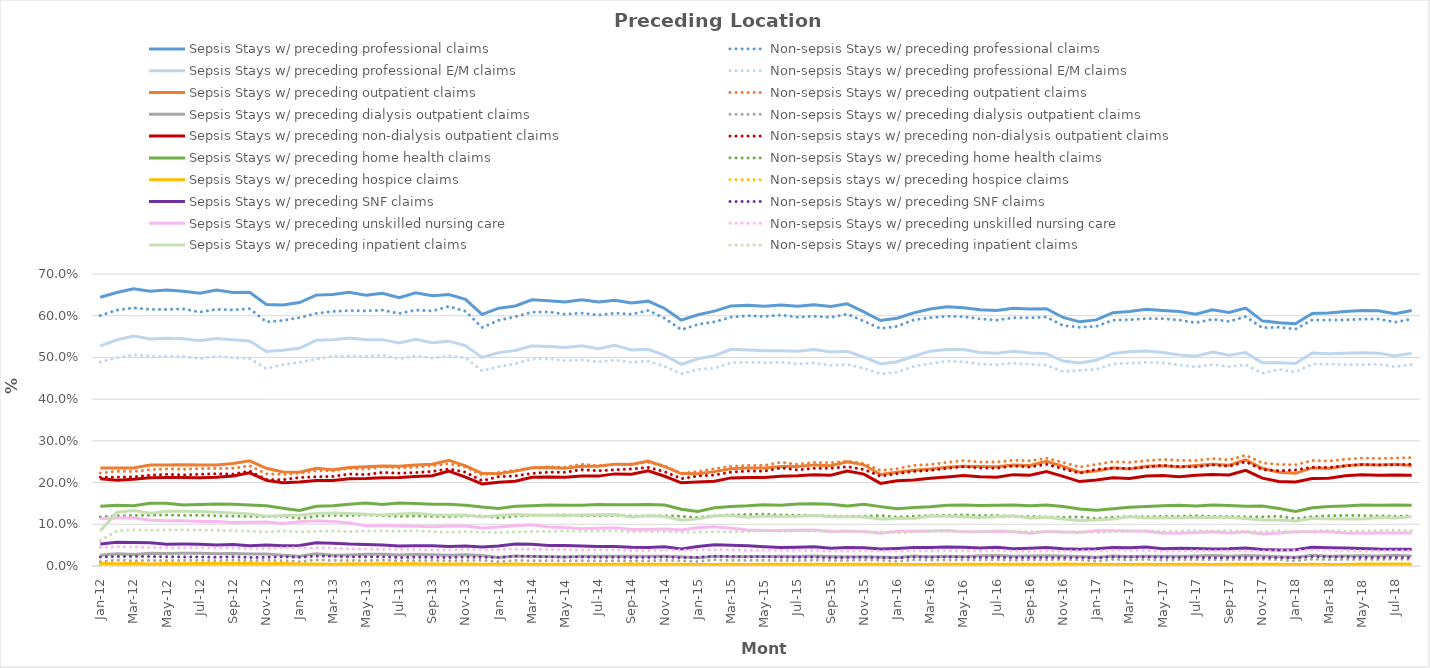
| Category | Sepsis Stays w/ preceding professional claims | Non-sepsis Stays w/ preceding professional claims | Sepsis Stays w/ preceding professional E/M claims | Non-sepsis Stays w/ preceding professional E/M claims | Sepsis Stays w/ preceding outpatient claims | Non-sepsis Stays w/ preceding outpatient claims | Sepsis Stays w/ preceding dialysis outpatient claims | Non-sepsis Stays w/ preceding dialysis outpatient claims | Sepsis Stays w/ preceding non-dialysis outpatient claims | Non-sepsis stays w/ preceding non-dialysis outpatient claims | Sepsis Stays w/ preceding home health claims | Non-sepsis Stays w/ preceding home health claims | Sepsis Stays w/ preceding hospice claims | Non-sepsis stays w/ preceding hospice claims | Sepsis Stays w/ preceding SNF claims | Non-sepsis Stays w/ preceding SNF claims | Sepsis Stays w/ preceding unskilled nursing care | Non-sepsis Stays w/ preceding unskilled nursing care | Sepsis Stays w/ preceding inpatient claims | Non-sepsis Stays w/ preceding inpatient claims |
|---|---|---|---|---|---|---|---|---|---|---|---|---|---|---|---|---|---|---|---|---|
| 2012-01-01 | 0.644 | 0.6 | 0.528 | 0.489 | 0.235 | 0.223 | 0.026 | 0.01 | 0.209 | 0.213 | 0.143 | 0.117 | 0.006 | 0.004 | 0.053 | 0.022 | 0.113 | 0.045 | 0.085 | 0.061 |
| 2012-02-01 | 0.656 | 0.614 | 0.542 | 0.499 | 0.235 | 0.227 | 0.029 | 0.014 | 0.205 | 0.213 | 0.145 | 0.12 | 0.005 | 0.004 | 0.057 | 0.023 | 0.115 | 0.046 | 0.129 | 0.084 |
| 2012-03-01 | 0.665 | 0.619 | 0.551 | 0.506 | 0.235 | 0.227 | 0.027 | 0.013 | 0.208 | 0.214 | 0.144 | 0.121 | 0.006 | 0.003 | 0.056 | 0.023 | 0.116 | 0.046 | 0.133 | 0.087 |
| 2012-04-01 | 0.659 | 0.615 | 0.544 | 0.503 | 0.242 | 0.231 | 0.03 | 0.013 | 0.212 | 0.218 | 0.15 | 0.122 | 0.005 | 0.004 | 0.056 | 0.023 | 0.11 | 0.044 | 0.126 | 0.086 |
| 2012-05-01 | 0.662 | 0.615 | 0.546 | 0.502 | 0.242 | 0.233 | 0.03 | 0.013 | 0.212 | 0.22 | 0.15 | 0.122 | 0.006 | 0.003 | 0.052 | 0.022 | 0.108 | 0.044 | 0.131 | 0.086 |
| 2012-06-01 | 0.659 | 0.616 | 0.545 | 0.503 | 0.243 | 0.232 | 0.031 | 0.013 | 0.212 | 0.218 | 0.146 | 0.121 | 0.006 | 0.004 | 0.052 | 0.022 | 0.109 | 0.044 | 0.131 | 0.087 |
| 2012-07-01 | 0.654 | 0.609 | 0.54 | 0.497 | 0.242 | 0.234 | 0.031 | 0.014 | 0.211 | 0.22 | 0.147 | 0.122 | 0.006 | 0.004 | 0.052 | 0.022 | 0.106 | 0.044 | 0.13 | 0.086 |
| 2012-08-01 | 0.662 | 0.615 | 0.545 | 0.503 | 0.242 | 0.234 | 0.029 | 0.013 | 0.213 | 0.221 | 0.149 | 0.12 | 0.006 | 0.003 | 0.05 | 0.021 | 0.106 | 0.043 | 0.129 | 0.086 |
| 2012-09-01 | 0.656 | 0.614 | 0.542 | 0.499 | 0.246 | 0.234 | 0.03 | 0.014 | 0.216 | 0.22 | 0.148 | 0.119 | 0.006 | 0.004 | 0.052 | 0.022 | 0.104 | 0.043 | 0.127 | 0.085 |
| 2012-10-01 | 0.656 | 0.617 | 0.54 | 0.497 | 0.252 | 0.24 | 0.029 | 0.013 | 0.224 | 0.228 | 0.146 | 0.119 | 0.006 | 0.003 | 0.049 | 0.02 | 0.105 | 0.042 | 0.125 | 0.083 |
| 2012-11-01 | 0.627 | 0.585 | 0.514 | 0.473 | 0.234 | 0.221 | 0.029 | 0.014 | 0.205 | 0.207 | 0.145 | 0.118 | 0.005 | 0.003 | 0.05 | 0.021 | 0.105 | 0.042 | 0.119 | 0.082 |
| 2012-12-01 | 0.626 | 0.589 | 0.517 | 0.483 | 0.225 | 0.219 | 0.026 | 0.013 | 0.199 | 0.207 | 0.138 | 0.119 | 0.006 | 0.003 | 0.049 | 0.022 | 0.102 | 0.044 | 0.121 | 0.084 |
| 2013-01-01 | 0.632 | 0.595 | 0.522 | 0.488 | 0.225 | 0.223 | 0.023 | 0.011 | 0.201 | 0.212 | 0.133 | 0.114 | 0.005 | 0.003 | 0.049 | 0.021 | 0.106 | 0.044 | 0.122 | 0.082 |
| 2013-02-01 | 0.649 | 0.605 | 0.541 | 0.496 | 0.234 | 0.228 | 0.029 | 0.015 | 0.205 | 0.214 | 0.143 | 0.119 | 0.005 | 0.003 | 0.056 | 0.024 | 0.108 | 0.044 | 0.126 | 0.083 |
| 2013-03-01 | 0.651 | 0.61 | 0.542 | 0.503 | 0.231 | 0.228 | 0.026 | 0.013 | 0.205 | 0.215 | 0.145 | 0.121 | 0.004 | 0.003 | 0.055 | 0.023 | 0.107 | 0.043 | 0.127 | 0.084 |
| 2013-04-01 | 0.656 | 0.612 | 0.547 | 0.503 | 0.236 | 0.234 | 0.027 | 0.013 | 0.209 | 0.221 | 0.148 | 0.121 | 0.005 | 0.003 | 0.053 | 0.022 | 0.103 | 0.041 | 0.126 | 0.082 |
| 2013-05-01 | 0.649 | 0.612 | 0.542 | 0.503 | 0.238 | 0.232 | 0.028 | 0.013 | 0.21 | 0.219 | 0.151 | 0.122 | 0.005 | 0.003 | 0.052 | 0.022 | 0.096 | 0.04 | 0.124 | 0.084 |
| 2013-06-01 | 0.654 | 0.613 | 0.543 | 0.505 | 0.24 | 0.238 | 0.028 | 0.014 | 0.211 | 0.224 | 0.148 | 0.12 | 0.006 | 0.003 | 0.051 | 0.022 | 0.097 | 0.04 | 0.122 | 0.084 |
| 2013-07-01 | 0.643 | 0.605 | 0.535 | 0.497 | 0.239 | 0.235 | 0.027 | 0.013 | 0.212 | 0.222 | 0.151 | 0.119 | 0.005 | 0.003 | 0.048 | 0.02 | 0.096 | 0.04 | 0.125 | 0.083 |
| 2013-08-01 | 0.655 | 0.613 | 0.543 | 0.503 | 0.242 | 0.237 | 0.027 | 0.013 | 0.215 | 0.224 | 0.15 | 0.12 | 0.005 | 0.003 | 0.048 | 0.021 | 0.095 | 0.039 | 0.126 | 0.084 |
| 2013-09-01 | 0.648 | 0.611 | 0.535 | 0.498 | 0.244 | 0.24 | 0.027 | 0.013 | 0.217 | 0.227 | 0.148 | 0.119 | 0.005 | 0.003 | 0.049 | 0.021 | 0.094 | 0.038 | 0.123 | 0.083 |
| 2013-10-01 | 0.651 | 0.622 | 0.539 | 0.504 | 0.253 | 0.245 | 0.026 | 0.013 | 0.228 | 0.233 | 0.148 | 0.118 | 0.005 | 0.003 | 0.047 | 0.02 | 0.096 | 0.039 | 0.122 | 0.081 |
| 2013-11-01 | 0.639 | 0.611 | 0.528 | 0.499 | 0.24 | 0.238 | 0.027 | 0.013 | 0.213 | 0.225 | 0.146 | 0.12 | 0.005 | 0.003 | 0.048 | 0.021 | 0.096 | 0.04 | 0.122 | 0.083 |
| 2013-12-01 | 0.603 | 0.572 | 0.5 | 0.468 | 0.222 | 0.218 | 0.025 | 0.014 | 0.197 | 0.204 | 0.141 | 0.12 | 0.004 | 0.003 | 0.045 | 0.021 | 0.091 | 0.039 | 0.117 | 0.081 |
| 2014-01-01 | 0.618 | 0.589 | 0.512 | 0.478 | 0.221 | 0.224 | 0.021 | 0.01 | 0.201 | 0.214 | 0.138 | 0.116 | 0.004 | 0.003 | 0.048 | 0.021 | 0.094 | 0.039 | 0.121 | 0.08 |
| 2014-02-01 | 0.623 | 0.598 | 0.517 | 0.485 | 0.227 | 0.229 | 0.024 | 0.013 | 0.203 | 0.216 | 0.143 | 0.119 | 0.005 | 0.003 | 0.053 | 0.023 | 0.096 | 0.041 | 0.123 | 0.082 |
| 2014-03-01 | 0.638 | 0.608 | 0.528 | 0.496 | 0.235 | 0.235 | 0.023 | 0.013 | 0.213 | 0.222 | 0.144 | 0.121 | 0.004 | 0.003 | 0.052 | 0.023 | 0.099 | 0.04 | 0.122 | 0.083 |
| 2014-04-01 | 0.636 | 0.609 | 0.526 | 0.497 | 0.236 | 0.238 | 0.023 | 0.013 | 0.214 | 0.225 | 0.146 | 0.122 | 0.004 | 0.003 | 0.049 | 0.022 | 0.094 | 0.039 | 0.122 | 0.083 |
| 2014-05-01 | 0.633 | 0.604 | 0.524 | 0.492 | 0.234 | 0.237 | 0.022 | 0.012 | 0.213 | 0.225 | 0.145 | 0.123 | 0.004 | 0.003 | 0.049 | 0.022 | 0.092 | 0.04 | 0.121 | 0.084 |
| 2014-06-01 | 0.638 | 0.606 | 0.528 | 0.494 | 0.239 | 0.244 | 0.023 | 0.013 | 0.216 | 0.231 | 0.145 | 0.12 | 0.004 | 0.003 | 0.048 | 0.022 | 0.089 | 0.038 | 0.122 | 0.083 |
| 2014-07-01 | 0.633 | 0.601 | 0.521 | 0.489 | 0.239 | 0.241 | 0.023 | 0.012 | 0.215 | 0.228 | 0.147 | 0.121 | 0.004 | 0.003 | 0.047 | 0.021 | 0.091 | 0.039 | 0.123 | 0.084 |
| 2014-08-01 | 0.637 | 0.606 | 0.529 | 0.494 | 0.244 | 0.243 | 0.023 | 0.013 | 0.221 | 0.231 | 0.147 | 0.121 | 0.004 | 0.003 | 0.047 | 0.021 | 0.092 | 0.039 | 0.123 | 0.084 |
| 2014-09-01 | 0.63 | 0.604 | 0.518 | 0.488 | 0.243 | 0.245 | 0.023 | 0.012 | 0.22 | 0.233 | 0.147 | 0.12 | 0.005 | 0.003 | 0.045 | 0.021 | 0.088 | 0.037 | 0.117 | 0.082 |
| 2014-10-01 | 0.635 | 0.613 | 0.52 | 0.491 | 0.252 | 0.249 | 0.024 | 0.012 | 0.228 | 0.236 | 0.147 | 0.12 | 0.004 | 0.003 | 0.045 | 0.021 | 0.088 | 0.037 | 0.121 | 0.082 |
| 2014-11-01 | 0.617 | 0.594 | 0.505 | 0.479 | 0.238 | 0.24 | 0.023 | 0.014 | 0.215 | 0.226 | 0.146 | 0.121 | 0.004 | 0.003 | 0.046 | 0.022 | 0.089 | 0.038 | 0.118 | 0.082 |
| 2014-12-01 | 0.589 | 0.566 | 0.484 | 0.461 | 0.221 | 0.222 | 0.022 | 0.013 | 0.199 | 0.209 | 0.136 | 0.119 | 0.004 | 0.002 | 0.041 | 0.02 | 0.086 | 0.038 | 0.11 | 0.081 |
| 2015-01-01 | 0.602 | 0.579 | 0.497 | 0.471 | 0.221 | 0.226 | 0.02 | 0.011 | 0.201 | 0.216 | 0.131 | 0.116 | 0.004 | 0.002 | 0.047 | 0.021 | 0.092 | 0.039 | 0.113 | 0.081 |
| 2015-02-01 | 0.611 | 0.585 | 0.504 | 0.474 | 0.226 | 0.233 | 0.023 | 0.015 | 0.203 | 0.218 | 0.139 | 0.121 | 0.004 | 0.002 | 0.051 | 0.023 | 0.094 | 0.039 | 0.12 | 0.082 |
| 2015-03-01 | 0.623 | 0.597 | 0.52 | 0.487 | 0.233 | 0.239 | 0.022 | 0.014 | 0.211 | 0.225 | 0.143 | 0.123 | 0.004 | 0.002 | 0.05 | 0.023 | 0.09 | 0.039 | 0.121 | 0.082 |
| 2015-04-01 | 0.625 | 0.6 | 0.518 | 0.489 | 0.235 | 0.241 | 0.023 | 0.013 | 0.212 | 0.228 | 0.144 | 0.123 | 0.004 | 0.002 | 0.048 | 0.022 | 0.087 | 0.037 | 0.117 | 0.083 |
| 2015-05-01 | 0.622 | 0.598 | 0.516 | 0.487 | 0.235 | 0.241 | 0.023 | 0.014 | 0.212 | 0.227 | 0.147 | 0.124 | 0.004 | 0.002 | 0.046 | 0.022 | 0.085 | 0.038 | 0.12 | 0.084 |
| 2015-06-01 | 0.626 | 0.602 | 0.516 | 0.489 | 0.239 | 0.249 | 0.024 | 0.014 | 0.215 | 0.235 | 0.146 | 0.122 | 0.004 | 0.003 | 0.044 | 0.021 | 0.085 | 0.037 | 0.119 | 0.083 |
| 2015-07-01 | 0.623 | 0.597 | 0.515 | 0.484 | 0.239 | 0.243 | 0.023 | 0.013 | 0.216 | 0.23 | 0.149 | 0.122 | 0.004 | 0.003 | 0.045 | 0.021 | 0.086 | 0.037 | 0.119 | 0.084 |
| 2015-08-01 | 0.626 | 0.599 | 0.519 | 0.486 | 0.242 | 0.248 | 0.024 | 0.014 | 0.219 | 0.234 | 0.149 | 0.121 | 0.004 | 0.003 | 0.046 | 0.021 | 0.086 | 0.037 | 0.121 | 0.084 |
| 2015-09-01 | 0.622 | 0.596 | 0.513 | 0.481 | 0.24 | 0.248 | 0.023 | 0.013 | 0.217 | 0.234 | 0.148 | 0.12 | 0.004 | 0.003 | 0.042 | 0.02 | 0.083 | 0.036 | 0.118 | 0.081 |
| 2015-10-01 | 0.629 | 0.604 | 0.515 | 0.483 | 0.25 | 0.251 | 0.022 | 0.013 | 0.227 | 0.238 | 0.144 | 0.119 | 0.004 | 0.003 | 0.044 | 0.021 | 0.084 | 0.036 | 0.118 | 0.082 |
| 2015-11-01 | 0.609 | 0.587 | 0.501 | 0.474 | 0.243 | 0.246 | 0.022 | 0.014 | 0.22 | 0.231 | 0.148 | 0.119 | 0.004 | 0.003 | 0.044 | 0.021 | 0.083 | 0.036 | 0.118 | 0.082 |
| 2015-12-01 | 0.588 | 0.569 | 0.484 | 0.461 | 0.219 | 0.229 | 0.021 | 0.014 | 0.198 | 0.215 | 0.142 | 0.121 | 0.004 | 0.003 | 0.041 | 0.02 | 0.079 | 0.036 | 0.113 | 0.082 |
| 2016-01-01 | 0.594 | 0.574 | 0.49 | 0.464 | 0.225 | 0.233 | 0.021 | 0.012 | 0.204 | 0.222 | 0.137 | 0.117 | 0.004 | 0.002 | 0.042 | 0.02 | 0.083 | 0.036 | 0.114 | 0.079 |
| 2016-02-01 | 0.607 | 0.59 | 0.503 | 0.479 | 0.23 | 0.241 | 0.024 | 0.014 | 0.206 | 0.227 | 0.14 | 0.119 | 0.003 | 0.002 | 0.044 | 0.021 | 0.083 | 0.037 | 0.115 | 0.081 |
| 2016-03-01 | 0.616 | 0.595 | 0.515 | 0.485 | 0.232 | 0.243 | 0.022 | 0.014 | 0.21 | 0.229 | 0.142 | 0.121 | 0.004 | 0.002 | 0.045 | 0.021 | 0.084 | 0.037 | 0.119 | 0.083 |
| 2016-04-01 | 0.621 | 0.599 | 0.519 | 0.491 | 0.237 | 0.248 | 0.023 | 0.014 | 0.213 | 0.234 | 0.146 | 0.122 | 0.004 | 0.002 | 0.046 | 0.022 | 0.085 | 0.037 | 0.119 | 0.083 |
| 2016-05-01 | 0.619 | 0.598 | 0.519 | 0.49 | 0.239 | 0.253 | 0.022 | 0.014 | 0.217 | 0.238 | 0.146 | 0.123 | 0.004 | 0.003 | 0.045 | 0.021 | 0.082 | 0.036 | 0.118 | 0.082 |
| 2016-06-01 | 0.614 | 0.592 | 0.512 | 0.484 | 0.238 | 0.249 | 0.024 | 0.014 | 0.214 | 0.235 | 0.145 | 0.121 | 0.004 | 0.002 | 0.043 | 0.02 | 0.082 | 0.036 | 0.117 | 0.083 |
| 2016-07-01 | 0.613 | 0.59 | 0.51 | 0.483 | 0.238 | 0.249 | 0.025 | 0.015 | 0.213 | 0.234 | 0.145 | 0.121 | 0.004 | 0.003 | 0.045 | 0.021 | 0.083 | 0.037 | 0.118 | 0.085 |
| 2016-08-01 | 0.618 | 0.595 | 0.515 | 0.486 | 0.242 | 0.254 | 0.023 | 0.014 | 0.219 | 0.24 | 0.146 | 0.119 | 0.004 | 0.002 | 0.041 | 0.02 | 0.082 | 0.036 | 0.12 | 0.083 |
| 2016-09-01 | 0.616 | 0.595 | 0.51 | 0.483 | 0.241 | 0.252 | 0.024 | 0.015 | 0.217 | 0.237 | 0.144 | 0.119 | 0.004 | 0.002 | 0.042 | 0.02 | 0.078 | 0.036 | 0.115 | 0.083 |
| 2016-10-01 | 0.617 | 0.597 | 0.509 | 0.482 | 0.251 | 0.258 | 0.025 | 0.015 | 0.226 | 0.244 | 0.146 | 0.118 | 0.004 | 0.003 | 0.044 | 0.02 | 0.083 | 0.036 | 0.117 | 0.082 |
| 2016-11-01 | 0.596 | 0.576 | 0.491 | 0.466 | 0.239 | 0.248 | 0.024 | 0.015 | 0.215 | 0.233 | 0.143 | 0.117 | 0.005 | 0.002 | 0.041 | 0.02 | 0.082 | 0.036 | 0.113 | 0.081 |
| 2016-12-01 | 0.585 | 0.572 | 0.487 | 0.469 | 0.225 | 0.237 | 0.023 | 0.015 | 0.202 | 0.223 | 0.136 | 0.118 | 0.004 | 0.002 | 0.04 | 0.02 | 0.08 | 0.037 | 0.109 | 0.083 |
| 2017-01-01 | 0.59 | 0.575 | 0.493 | 0.472 | 0.228 | 0.244 | 0.021 | 0.012 | 0.206 | 0.232 | 0.133 | 0.114 | 0.004 | 0.002 | 0.041 | 0.02 | 0.084 | 0.036 | 0.11 | 0.08 |
| 2017-02-01 | 0.607 | 0.589 | 0.51 | 0.485 | 0.235 | 0.25 | 0.024 | 0.016 | 0.211 | 0.234 | 0.138 | 0.117 | 0.004 | 0.002 | 0.044 | 0.022 | 0.084 | 0.038 | 0.113 | 0.082 |
| 2017-03-01 | 0.61 | 0.59 | 0.513 | 0.486 | 0.233 | 0.248 | 0.023 | 0.015 | 0.21 | 0.234 | 0.141 | 0.119 | 0.004 | 0.002 | 0.044 | 0.021 | 0.084 | 0.038 | 0.118 | 0.083 |
| 2017-04-01 | 0.615 | 0.593 | 0.515 | 0.488 | 0.239 | 0.252 | 0.024 | 0.016 | 0.216 | 0.237 | 0.143 | 0.118 | 0.004 | 0.002 | 0.045 | 0.022 | 0.083 | 0.037 | 0.115 | 0.085 |
| 2017-05-01 | 0.612 | 0.593 | 0.512 | 0.487 | 0.24 | 0.255 | 0.023 | 0.014 | 0.217 | 0.241 | 0.145 | 0.119 | 0.004 | 0.002 | 0.042 | 0.021 | 0.079 | 0.035 | 0.115 | 0.083 |
| 2017-06-01 | 0.61 | 0.59 | 0.506 | 0.482 | 0.237 | 0.253 | 0.023 | 0.015 | 0.214 | 0.238 | 0.146 | 0.119 | 0.004 | 0.003 | 0.042 | 0.021 | 0.078 | 0.036 | 0.116 | 0.084 |
| 2017-07-01 | 0.604 | 0.583 | 0.503 | 0.477 | 0.241 | 0.253 | 0.024 | 0.015 | 0.217 | 0.238 | 0.144 | 0.12 | 0.004 | 0.003 | 0.042 | 0.021 | 0.08 | 0.037 | 0.116 | 0.085 |
| 2017-08-01 | 0.614 | 0.591 | 0.513 | 0.483 | 0.244 | 0.257 | 0.025 | 0.015 | 0.219 | 0.243 | 0.146 | 0.119 | 0.004 | 0.003 | 0.041 | 0.02 | 0.082 | 0.036 | 0.116 | 0.084 |
| 2017-09-01 | 0.608 | 0.586 | 0.505 | 0.478 | 0.241 | 0.254 | 0.023 | 0.015 | 0.218 | 0.239 | 0.145 | 0.119 | 0.004 | 0.003 | 0.041 | 0.02 | 0.079 | 0.036 | 0.116 | 0.085 |
| 2017-10-01 | 0.618 | 0.598 | 0.512 | 0.482 | 0.254 | 0.265 | 0.025 | 0.015 | 0.229 | 0.25 | 0.143 | 0.118 | 0.004 | 0.002 | 0.043 | 0.021 | 0.082 | 0.036 | 0.114 | 0.083 |
| 2017-11-01 | 0.588 | 0.571 | 0.487 | 0.462 | 0.234 | 0.247 | 0.024 | 0.016 | 0.211 | 0.231 | 0.144 | 0.118 | 0.004 | 0.003 | 0.04 | 0.02 | 0.077 | 0.035 | 0.11 | 0.082 |
| 2017-12-01 | 0.583 | 0.572 | 0.487 | 0.471 | 0.225 | 0.243 | 0.022 | 0.015 | 0.203 | 0.228 | 0.138 | 0.119 | 0.004 | 0.003 | 0.038 | 0.02 | 0.079 | 0.037 | 0.111 | 0.085 |
| 2018-01-01 | 0.581 | 0.568 | 0.485 | 0.465 | 0.222 | 0.243 | 0.021 | 0.012 | 0.201 | 0.23 | 0.131 | 0.113 | 0.004 | 0.002 | 0.039 | 0.02 | 0.082 | 0.037 | 0.108 | 0.08 |
| 2018-02-01 | 0.605 | 0.59 | 0.511 | 0.484 | 0.235 | 0.253 | 0.026 | 0.016 | 0.21 | 0.237 | 0.14 | 0.118 | 0.004 | 0.002 | 0.045 | 0.022 | 0.082 | 0.038 | 0.114 | 0.084 |
| 2018-03-01 | 0.606 | 0.59 | 0.509 | 0.484 | 0.234 | 0.252 | 0.023 | 0.015 | 0.21 | 0.236 | 0.142 | 0.12 | 0.004 | 0.003 | 0.044 | 0.022 | 0.082 | 0.038 | 0.113 | 0.085 |
| 2018-04-01 | 0.61 | 0.59 | 0.51 | 0.483 | 0.241 | 0.256 | 0.024 | 0.016 | 0.216 | 0.24 | 0.144 | 0.121 | 0.004 | 0.003 | 0.043 | 0.022 | 0.079 | 0.037 | 0.113 | 0.083 |
| 2018-05-01 | 0.612 | 0.592 | 0.511 | 0.483 | 0.243 | 0.259 | 0.025 | 0.016 | 0.219 | 0.243 | 0.146 | 0.121 | 0.005 | 0.003 | 0.042 | 0.02 | 0.078 | 0.036 | 0.112 | 0.084 |
| 2018-06-01 | 0.612 | 0.592 | 0.51 | 0.484 | 0.242 | 0.258 | 0.024 | 0.016 | 0.218 | 0.242 | 0.146 | 0.12 | 0.005 | 0.003 | 0.041 | 0.021 | 0.079 | 0.036 | 0.116 | 0.085 |
| 2018-07-01 | 0.605 | 0.584 | 0.503 | 0.478 | 0.244 | 0.259 | 0.026 | 0.016 | 0.218 | 0.242 | 0.146 | 0.119 | 0.005 | 0.003 | 0.04 | 0.021 | 0.079 | 0.037 | 0.115 | 0.086 |
| 2018-08-01 | 0.613 | 0.592 | 0.51 | 0.483 | 0.241 | 0.26 | 0.024 | 0.016 | 0.217 | 0.244 | 0.145 | 0.12 | 0.005 | 0.003 | 0.04 | 0.02 | 0.079 | 0.036 | 0.118 | 0.085 |